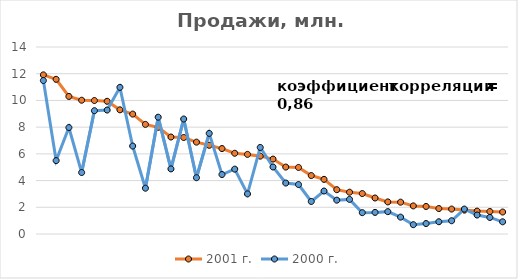
| Category | 2001 г. | 2000 г. |
|---|---|---|
| 0 | 11.914 | 11.49 |
| 1 | 11.58 | 5.495 |
| 2 | 10.299 | 7.969 |
| 3 | 10.015 | 4.602 |
| 4 | 9.993 | 9.233 |
| 5 | 9.936 | 9.279 |
| 6 | 9.296 | 10.978 |
| 7 | 8.977 | 6.584 |
| 8 | 8.205 | 3.429 |
| 9 | 7.984 | 8.745 |
| 10 | 7.26 | 4.874 |
| 11 | 7.225 | 8.609 |
| 12 | 6.878 | 4.214 |
| 13 | 6.642 | 7.532 |
| 14 | 6.397 | 4.453 |
| 15 | 6.045 | 4.856 |
| 16 | 5.959 | 3.003 |
| 17 | 5.829 | 6.479 |
| 18 | 5.608 | 5.017 |
| 19 | 5.01 | 3.815 |
| 20 | 4.983 | 3.704 |
| 21 | 4.375 | 2.434 |
| 22 | 4.091 | 3.218 |
| 23 | 3.318 | 2.533 |
| 24 | 3.129 | 2.592 |
| 25 | 3.028 | 1.597 |
| 26 | 2.696 | 1.617 |
| 27 | 2.402 | 1.674 |
| 28 | 2.384 | 1.263 |
| 29 | 2.103 | 0.698 |
| 30 | 2.062 | 0.782 |
| 31 | 1.905 | 0.918 |
| 32 | 1.867 | 0.993 |
| 33 | 1.788 | 1.867 |
| 34 | 1.715 | 1.42 |
| 35 | 1.682 | 1.24 |
| 36 | 1.645 | 0.913 |